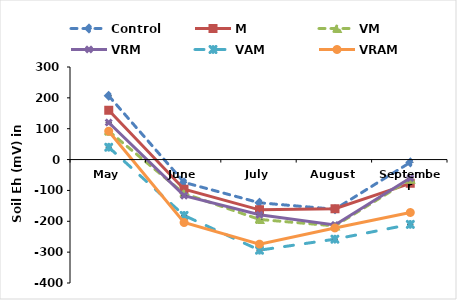
| Category | Control | M | VM | VRM | VAM | VRAM |
|---|---|---|---|---|---|---|
| May | 206.592 | 160 | 92 | 120 | 40 | 92 |
| June | -74 | -96 | -110 | -117 | -181 | -204 |
| July | -140 | -163 | -194 | -179 | -293.696 | -274 |
| August | -161 | -159 | -215 | -212 | -258 | -221.6 |
| September | -9 | -77 | -64 | -60 | -210 | -171.53 |